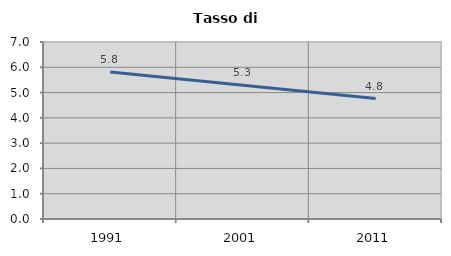
| Category | Tasso di disoccupazione   |
|---|---|
| 1991.0 | 5.817 |
| 2001.0 | 5.29 |
| 2011.0 | 4.762 |